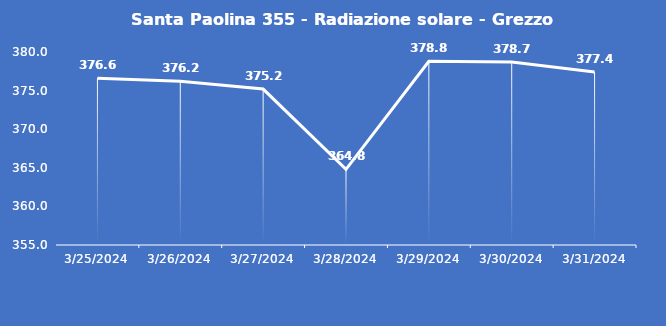
| Category | Santa Paolina 355 - Radiazione solare - Grezzo (W/m2) |
|---|---|
| 3/25/24 | 376.6 |
| 3/26/24 | 376.2 |
| 3/27/24 | 375.2 |
| 3/28/24 | 364.8 |
| 3/29/24 | 378.8 |
| 3/30/24 | 378.7 |
| 3/31/24 | 377.4 |